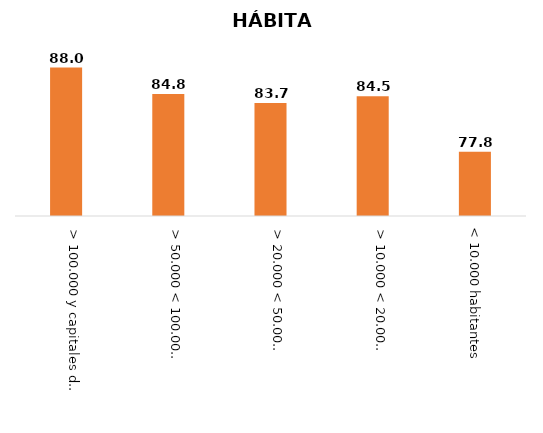
| Category | Series 0 |
|---|---|
| > 100.000 y capitales de provincia | 88 |
| > 50.000 < 100.000 habitantes | 84.8 |
| > 20.000 < 50.000 habitantes | 83.7 |
| > 10.000 < 20.000 habitantes | 84.5 |
| < 10.000 habitantes | 77.8 |